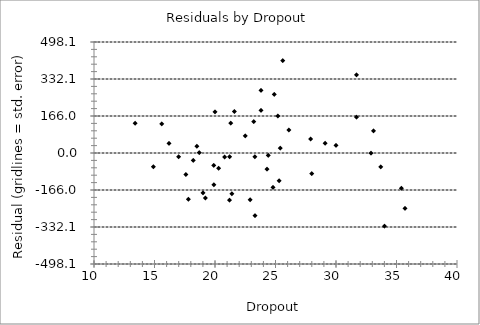
| Category | Series 0 |
|---|---|
| 33.1 | 99.434 |
| 13.4 | 133.589 |
| 21.3 | 134.136 |
| 33.7 | -62.296 |
| 23.8 | 281.259 |
| 15.6 | 130.577 |
| 20.8 | -18.088 |
| 22.5 | 76.675 |
| 25.6 | 414.067 |
| 29.1 | 43.638 |
| 19.9 | -142.492 |
| 20.3 | -68.313 |
| 23.8 | 191.259 |
| 24.4 | -10.472 |
| 19.9 | -55.492 |
| 18.7 | 1.969 |
| 35.4 | -158.533 |
| 31.7 | 160.806 |
| 21.2 | -211.909 |
| 21.6 | 186.271 |
| 20.0 | 184.552 |
| 23.2 | 140.989 |
| 17.6 | -96.525 |
| 35.7 | -248.399 |
| 26.1 | 103.291 |
| 19.0 | -178.896 |
| 18.2 | -33.256 |
| 21.2 | -16.909 |
| 17.8 | -207.435 |
| 23.3 | -16.966 |
| 24.9 | 262.752 |
| 25.2 | 165.887 |
| 30.0 | 34.042 |
| 23.3 | -280.966 |
| 24.3 | -72.517 |
| 25.4 | 21.977 |
| 18.5 | 29.879 |
| 25.3 | -125.068 |
| 28.0 | -92.856 |
| 31.7 | 350.806 |
| 22.9 | -210.145 |
| 32.9 | -0.656 |
| 27.9 | 63.099 |
| 14.9 | -61.737 |
| 19.2 | -201.807 |
| 24.8 | -154.292 |
| 16.2 | 42.846 |
| 34.0 | -328.162 |
| 21.4 | -182.819 |
| 17.0 | -16.794 |